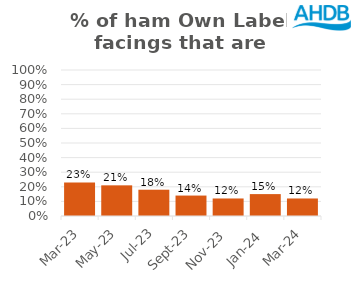
| Category | Ham |
|---|---|
| 2023-03-01 | 0.23 |
| 2023-05-01 | 0.21 |
| 2023-07-01 | 0.18 |
| 2023-09-01 | 0.14 |
| 2023-11-01 | 0.12 |
| 2024-01-01 | 0.15 |
| 2024-03-01 | 0.12 |